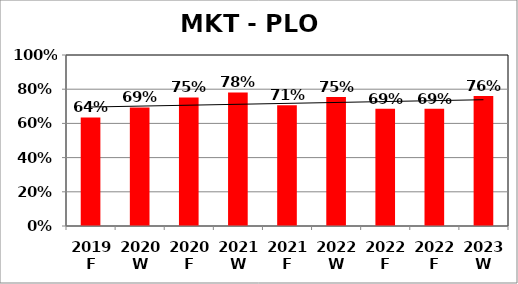
| Category | Series 0 |
|---|---|
| 2019 F | 0.635 |
| 2020 W | 0.693 |
| 2020 F | 0.752 |
| 2021 W | 0.781 |
| 2021 F | 0.706 |
| 2022 W | 0.755 |
| 2022 F | 0.686 |
| 2022 F | 0.686 |
| 2023 W | 0.76 |